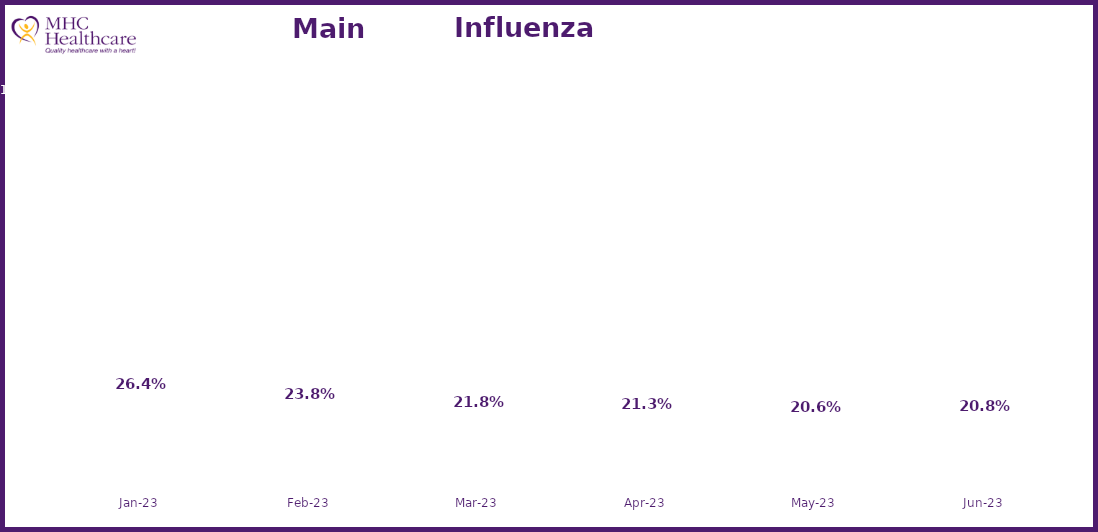
| Category | Online Access to Health Information |
|---|---|
| 2023-01-01 | 0.264 |
| 2023-02-01 | 0.238 |
| 2023-03-01 | 0.218 |
| 2023-04-01 | 0.213 |
| 2023-05-01 | 0.206 |
| 2023-06-01 | 0.208 |